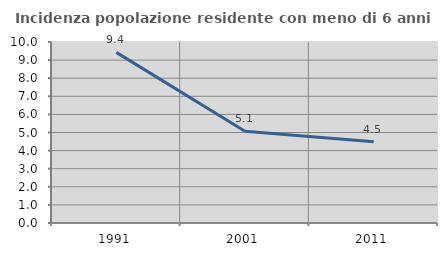
| Category | Incidenza popolazione residente con meno di 6 anni |
|---|---|
| 1991.0 | 9.425 |
| 2001.0 | 5.072 |
| 2011.0 | 4.489 |